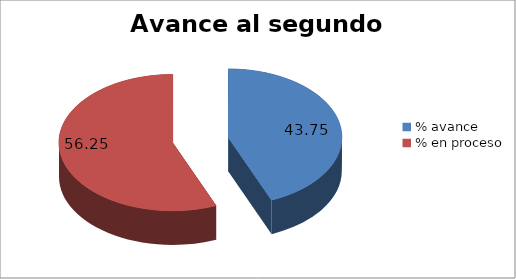
| Category | Series 0 |
|---|---|
| % avance | 43.75 |
| % en proceso | 56.25 |